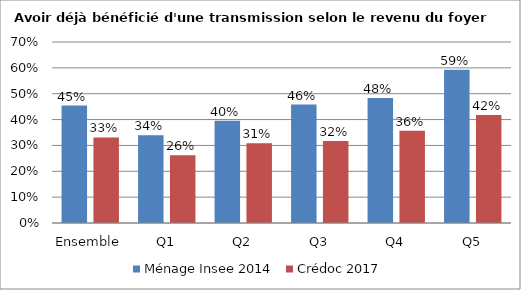
| Category | Ménage Insee 2014 | Crédoc 2017 |
|---|---|---|
| Ensemble | 0.454 | 0.331 |
| Q1 | 0.339 | 0.262 |
| Q2 | 0.395 | 0.308 |
| Q3 | 0.458 | 0.317 |
| Q4 | 0.483 | 0.357 |
| Q5 | 0.593 | 0.418 |